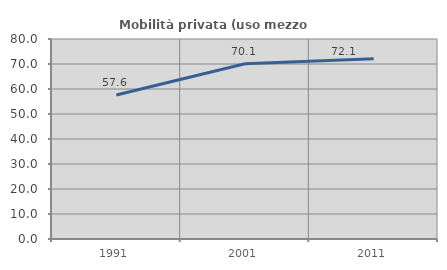
| Category | Mobilità privata (uso mezzo privato) |
|---|---|
| 1991.0 | 57.611 |
| 2001.0 | 70.081 |
| 2011.0 | 72.122 |